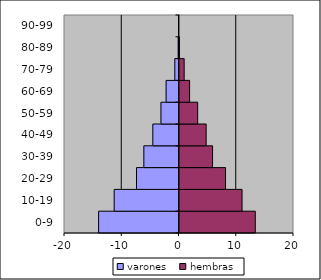
| Category | varones | hembras |
|---|---|---|
| 0-9 | -14.04 | 13.41 |
| 10-19 | -11.32 | 11.1 |
| 20-29 | -7.42 | 8.22 |
| 30-39 | -6.14 | 5.95 |
| 40-49 | -4.57 | 4.83 |
| 50-59 | -3.15 | 3.35 |
| 60-69 | -2.25 | 1.94 |
| 70-79 | -0.73 | 0.99 |
| 80-89 | -0.14 | 0.16 |
| 90-99 | 0 | 0.07 |